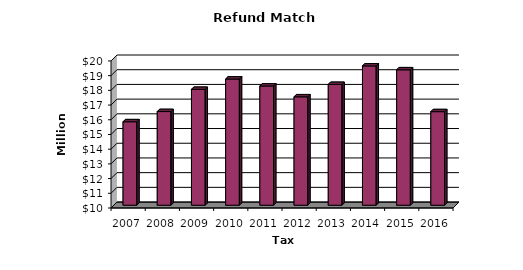
| Category | Total |
|---|---|
| 2007.0 | 15.673 |
| 2008.0 | 16.367 |
| 2009.0 | 17.876 |
| 2010.0 | 18.578 |
| 2011.0 | 18.105 |
| 2012.0 | 17.369 |
| 2013.0 | 18.212 |
| 2014.0 | 19.469 |
| 2015.0 | 19.206 |
| 2016.0 | 16.36 |